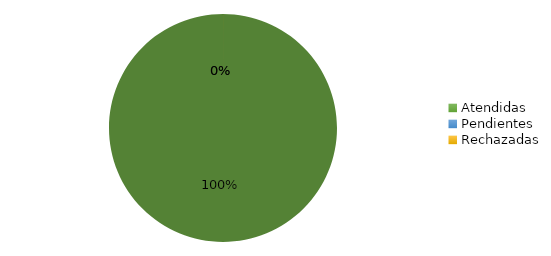
| Category | 3 |
|---|---|
| Atendidas | 3 |
| Pendientes  | 0 |
| Rechazadas | 0 |